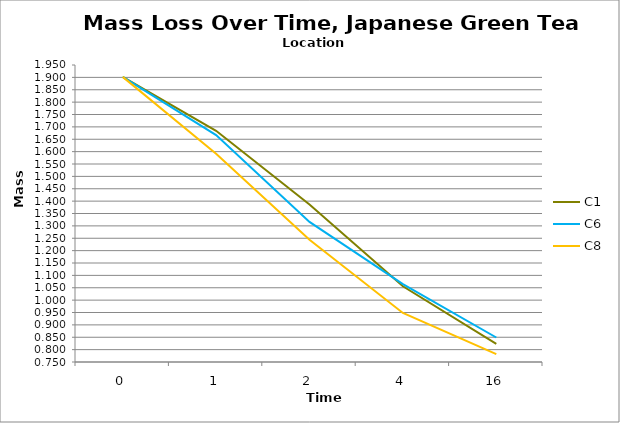
| Category | C1 | C6 | C8 |
|---|---|---|---|
| 0.0 | 1.902 | 1.902 | 1.902 |
| 1.0 | 1.684 | 1.667 | 1.591 |
| 2.0 | 1.386 | 1.316 | 1.244 |
| 4.0 | 1.056 | 1.065 | 0.948 |
| 16.0 | 0.823 | 0.849 | 0.782 |